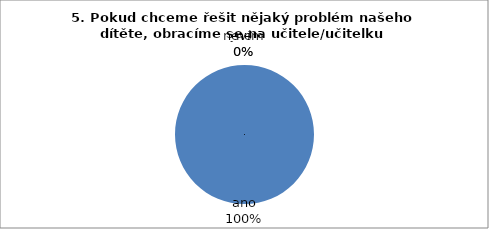
| Category | 5. |
|---|---|
| ano | 34 |
| ne | 0 |
| nevím | 0 |